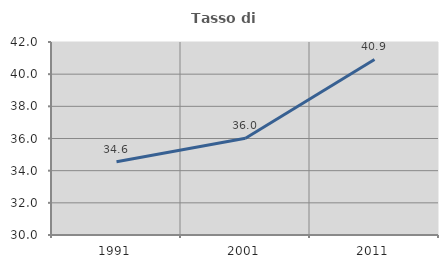
| Category | Tasso di occupazione   |
|---|---|
| 1991.0 | 34.556 |
| 2001.0 | 36.016 |
| 2011.0 | 40.915 |